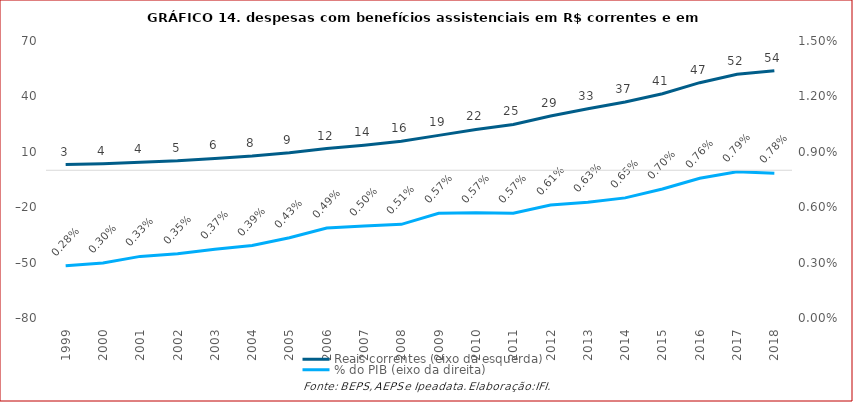
| Category | Reais correntes (eixo da esquerda) |
|---|---|
| 1999.0 | 3075302066.05 |
| 2000.0 | 3569658432.574 |
| 2001.0 | 4389486629.795 |
| 2002.0 | 5171886273.47 |
| 2003.0 | 6403287304 |
| 2004.0 | 7684446927 |
| 2005.0 | 9441255968 |
| 2006.0 | 11744765551.19 |
| 2007.0 | 13552767006.75 |
| 2008.0 | 15773493244.75 |
| 2009.0 | 18886684049.92 |
| 2010.0 | 22126220186.87 |
| 2011.0 | 24788154387.74 |
| 2012.0 | 29416528619.11 |
| 2013.0 | 33347870753.53 |
| 2014.0 | 36993600246.34 |
| 2015.0 | 41455134000 |
| 2016.0 | 47431420000 |
| 2017.0 | 51989542000 |
| 2018.0 | 53898365202.66 |